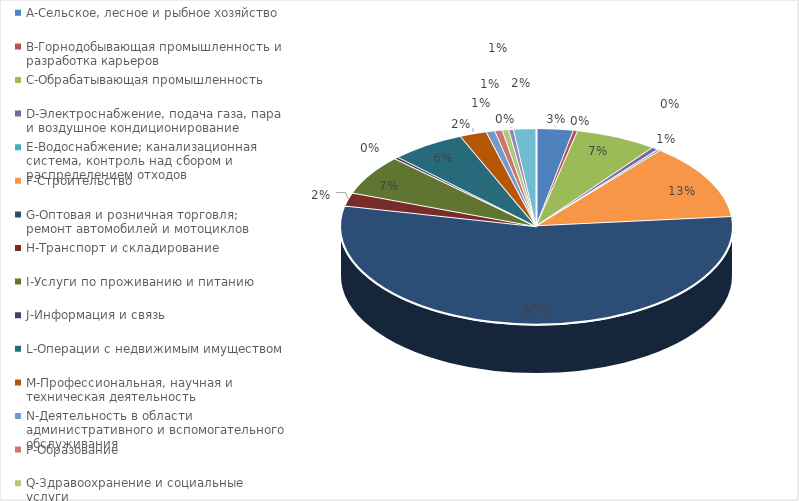
| Category | Series 0 |
|---|---|
| A-Сельское, лесное и рыбное хозяйство | 0.031 |
| B-Горнодобывающая промышленность и разработка карьеров | 0.004 |
| C-Обрабатывающая промышленность | 0.067 |
| D-Электроснабжение, подача газа, пара и воздушное кондиционирование | 0.005 |
| E-Водоснабжение; канализационная система, контроль над сбором и распределением отходов | 0.003 |
| F-Строительство | 0.126 |
| G-Оптовая и розничная торговля; ремонт автомобилей и мотоциклов | 0.549 |
| H-Транспорт и складирование | 0.022 |
| I-Услуги по проживанию и питанию | 0.066 |
| J-Информация и связь | 0.003 |
| L-Операции с недвижимым имуществом | 0.061 |
| M-Профессиональная, научная и техническая деятельность | 0.022 |
| N-Деятельность в области административного и вспомогательного обслуживания | 0.007 |
| P-Образование | 0.006 |
| Q-Здравоохранение и социальные услуги | 0.005 |
| R-Искусство, развлечения и отдых | 0.004 |
| S-Предоставление прочих видов услуг | 0.018 |